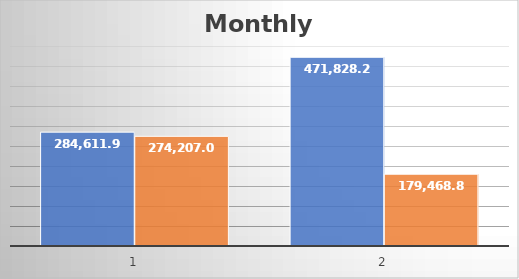
| Category | Series 0 | Series 1 |
|---|---|---|
| 0 | 284611.99 | 274207.05 |
| 1 | 471828.29 | 179468.89 |